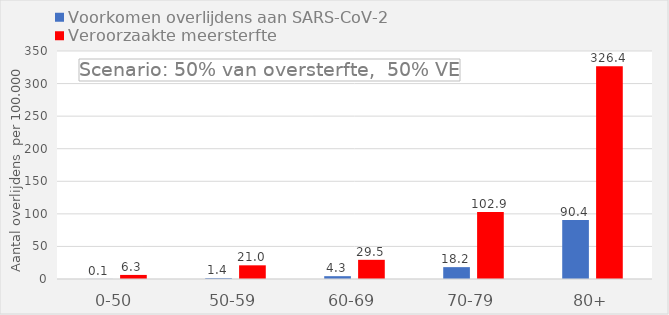
| Category | Voorkomen overlijdens aan SARS-CoV-2 | Veroorzaakte meersterfte |
|---|---|---|
| 0-50 | 0.104 | 6.25 |
| 50-59 | 1.35 | 21 |
| 60-69 | 4.34 | 29.45 |
| 70-79 | 18.2 | 102.85 |
| 80+ | 90.4 | 326.4 |